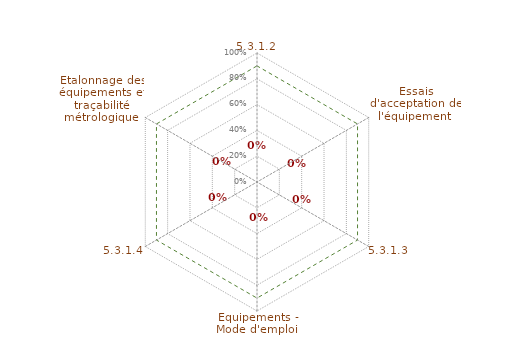
| Category | Conformité des Articles | 90% |
|---|---|---|
| 0 | 0 | 0.9 |
| 1 | 0 | 0.9 |
| 2 | 0 | 0.9 |
| 3 | 0 | 0.9 |
| 4 | 0 | 0.9 |
| 5 | 0 | 0.9 |